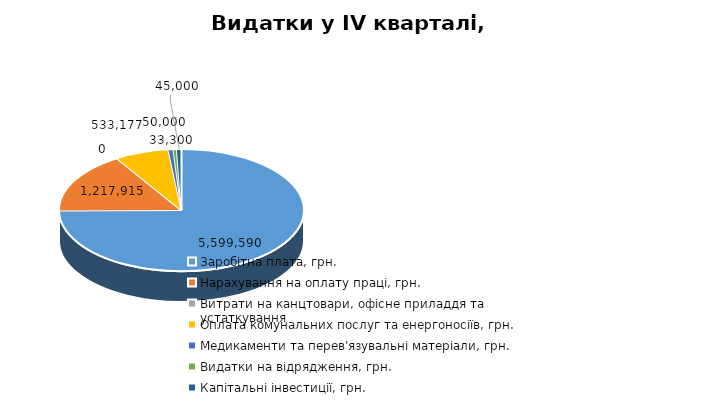
| Category | Видатки у IV кварталі, грн. |
|---|---|
| Заробітна плата, грн. | 5599590 |
| Нарахування на оплату праці, грн. | 1217915.4 |
| Витрати на канцтовари, офісне приладдя та устаткування  | 0 |
| Оплата комунальних послуг та енергоносіїв, грн. | 533177.098 |
| Медикаменти та перев'язувальні матеріали, грн. | 50000 |
| Видатки на відрядження, грн. | 33300 |
| Капітальні інвестиції, грн. | 45000 |